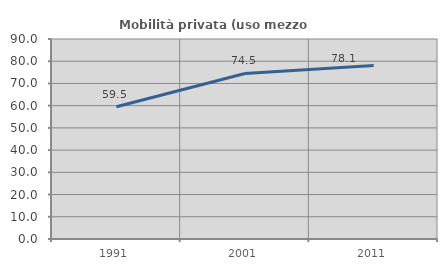
| Category | Mobilità privata (uso mezzo privato) |
|---|---|
| 1991.0 | 59.544 |
| 2001.0 | 74.503 |
| 2011.0 | 78.087 |